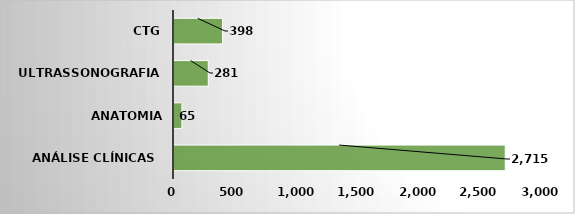
| Category | Series 0 |
|---|---|
| Análise Clínicas  | 2715 |
| Anatomia Patológica | 65 |
| Ultrassonografia  | 281 |
| CTG | 398 |